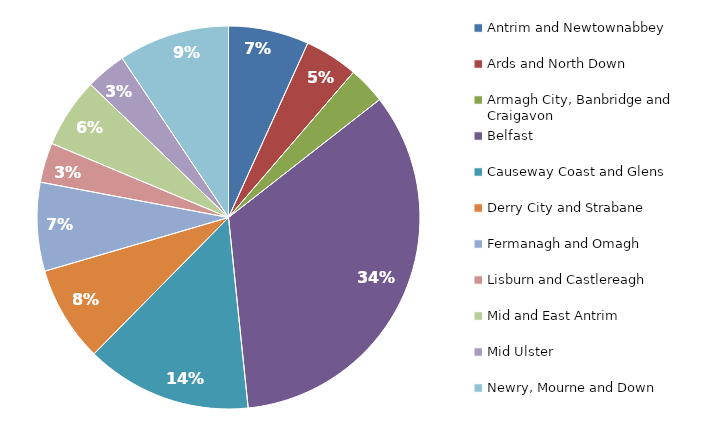
| Category | room stock |
|---|---|
| Antrim and Newtownabbey | 0.068 |
| Ards and North Down | 0.045 |
| Armagh City, Banbridge and Craigavon | 0.032 |
| Belfast | 0.339 |
| Causeway Coast and Glens | 0.14 |
| Derry City and Strabane | 0.081 |
| Fermanagh and Omagh | 0.075 |
| Lisburn and Castlereagh | 0.034 |
| Mid and East Antrim | 0.059 |
| Mid Ulster | 0.034 |
| Newry, Mourne and Down | 0.094 |